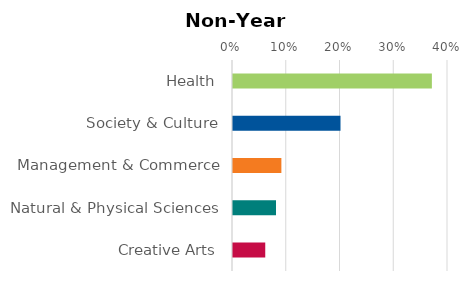
| Category | Series 0 |
|---|---|
| Health | 0.37 |
| Society & Culture | 0.2 |
| Management & Commerce | 0.09 |
| Natural & Physical Sciences | 0.08 |
| Creative Arts | 0.06 |